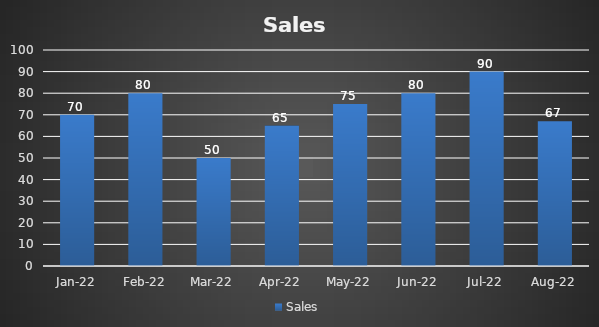
| Category | Sales |
|---|---|
| Jan-22 | 70 |
| Feb-22 | 80 |
| Mar-22 | 50 |
| Apr-22 | 65 |
| May-22 | 75 |
| Jun-22 | 80 |
| Jul-22 | 90 |
| Aug-22 | 67 |